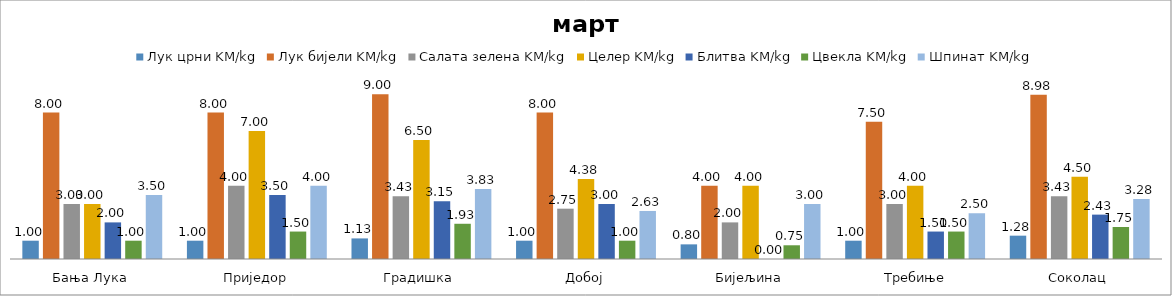
| Category | Лук црни KM/kg | Лук бијели KM/kg | Салата зелена KM/kg | Целер KM/kg | Блитва KM/kg | Цвекла KM/kg | Шпинат KM/kg |
|---|---|---|---|---|---|---|---|
| Бања Лука | 1 | 8 | 3 | 3 | 2 | 1 | 3.5 |
| Приједор | 1 | 8 | 4 | 7 | 3.5 | 1.5 | 4 |
| Градишка | 1.125 | 9 | 3.425 | 6.5 | 3.15 | 1.925 | 3.825 |
| Добој | 1 | 8 | 2.75 | 4.375 | 3 | 1 | 2.625 |
| Бијељина | 0.8 | 4 | 2 | 4 | 0 | 0.75 | 3 |
|  Требиње | 1 | 7.5 | 3 | 4 | 1.5 | 1.5 | 2.5 |
| Соколац | 1.275 | 8.975 | 3.425 | 4.5 | 2.425 | 1.75 | 3.275 |